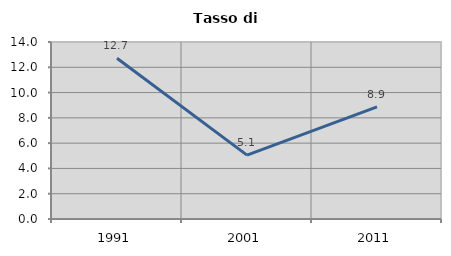
| Category | Tasso di disoccupazione   |
|---|---|
| 1991.0 | 12.716 |
| 2001.0 | 5.052 |
| 2011.0 | 8.87 |